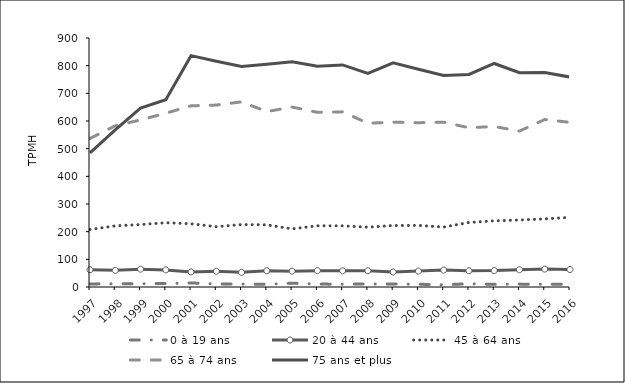
| Category | 0 à 19 ans | 20 à 44 ans | 45 à 64 ans | 65 à 74 ans | 75 ans et plus |
|---|---|---|---|---|---|
| 1997.0 | 11.2 | 62.3 | 207.8 | 536.9 | 485.1 |
| 1998.0 | 11.5 | 60.1 | 221.1 | 582.6 | 567.6 |
| 1999.0 | 11.8 | 64.5 | 225.7 | 604 | 646.4 |
| 2000.0 | 12.6 | 61.8 | 232.3 | 628.1 | 676.7 |
| 2001.0 | 14.7 | 54.4 | 228.4 | 654.9 | 836.2 |
| 2002.0 | 11.1 | 56.9 | 218.1 | 657.6 | 816.1 |
| 2003.0 | 10.5 | 53 | 225.8 | 669.2 | 796.7 |
| 2004.0 | 9.7 | 58.7 | 224.6 | 634.1 | 804.8 |
| 2005.0 | 13.7 | 57.2 | 210.2 | 650.3 | 813.7 |
| 2006.0 | 10.6 | 59.1 | 221.2 | 631.4 | 798.2 |
| 2007.0 | 10.1 | 58.4 | 221 | 633 | 802.7 |
| 2008.0 | 10.8 | 58.8 | 216.2 | 592 | 772.1 |
| 2009.0 | 10.9 | 54.2 | 222.2 | 595.7 | 810 |
| 2010.0 | 9.9 | 57.4 | 222.6 | 593.9 | 786.9 |
| 2011.0 | 8.1 | 61.2 | 216.7 | 595.8 | 764.3 |
| 2012.0 | 11.7 | 58.8 | 233.2 | 575.5 | 768.3 |
| 2013.0 | 9.6 | 59.4 | 239.2 | 580.2 | 807.9 |
| 2014.0 | 10.4 | 62.3 | 242.1 | 563.5 | 774.5 |
| 2015.0 | 9.9 | 64.7 | 246.3 | 605.3 | 775.4 |
| 2016.0 | 10.2 | 63.2 | 251.6 | 594.9 | 758.9 |